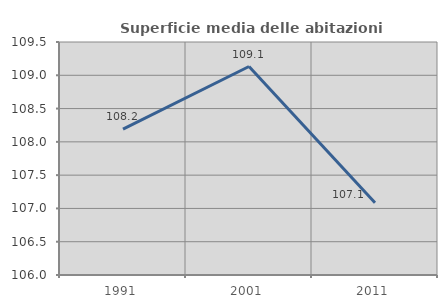
| Category | Superficie media delle abitazioni occupate |
|---|---|
| 1991.0 | 108.192 |
| 2001.0 | 109.132 |
| 2011.0 | 107.085 |